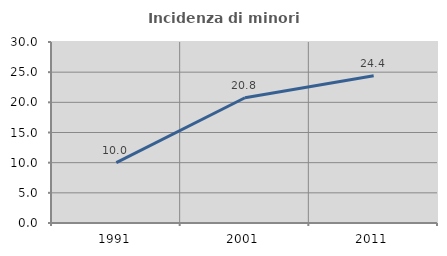
| Category | Incidenza di minori stranieri |
|---|---|
| 1991.0 | 10 |
| 2001.0 | 20.755 |
| 2011.0 | 24.422 |